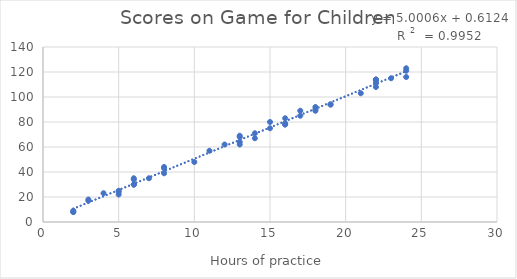
| Category | Score |
|---|---|
| 2.0 | 9 |
| 2.0 | 8 |
| 2.0 | 8 |
| 3.0 | 17 |
| 3.0 | 18 |
| 4.0 | 23 |
| 5.0 | 24 |
| 5.0 | 22 |
| 5.0 | 25 |
| 6.0 | 30 |
| 6.0 | 34 |
| 6.0 | 30 |
| 6.0 | 30 |
| 6.0 | 35 |
| 7.0 | 35 |
| 8.0 | 39 |
| 8.0 | 43 |
| 8.0 | 44 |
| 10.0 | 48 |
| 11.0 | 57 |
| 12.0 | 62 |
| 13.0 | 62 |
| 13.0 | 68 |
| 13.0 | 69 |
| 13.0 | 64 |
| 14.0 | 67 |
| 14.0 | 71 |
| 15.0 | 75 |
| 15.0 | 80 |
| 16.0 | 83 |
| 16.0 | 78 |
| 16.0 | 79 |
| 16.0 | 78 |
| 17.0 | 85 |
| 17.0 | 89 |
| 18.0 | 92 |
| 18.0 | 90 |
| 18.0 | 89 |
| 19.0 | 94 |
| 19.0 | 94 |
| 21.0 | 103 |
| 22.0 | 114 |
| 22.0 | 108 |
| 22.0 | 114 |
| 22.0 | 113 |
| 22.0 | 111 |
| 23.0 | 115 |
| 24.0 | 121 |
| 24.0 | 116 |
| 24.0 | 123 |